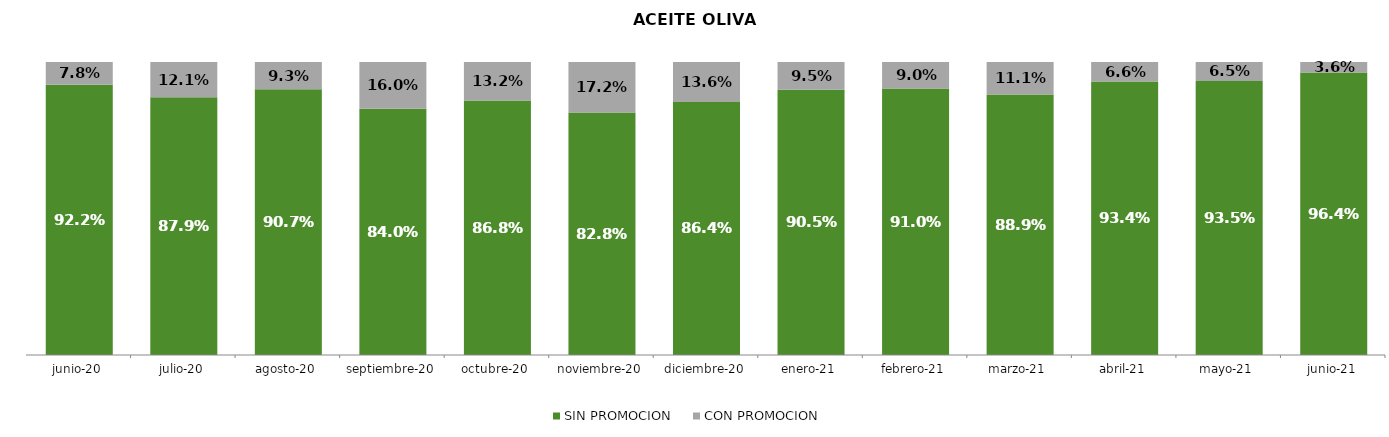
| Category | SIN PROMOCION   | CON PROMOCION   |
|---|---|---|
| 2020-06-01 | 0.922 | 0.078 |
| 2020-07-01 | 0.879 | 0.121 |
| 2020-08-01 | 0.907 | 0.093 |
| 2020-09-01 | 0.84 | 0.16 |
| 2020-10-01 | 0.868 | 0.132 |
| 2020-11-01 | 0.828 | 0.172 |
| 2020-12-01 | 0.864 | 0.136 |
| 2021-01-01 | 0.905 | 0.095 |
| 2021-02-01 | 0.91 | 0.09 |
| 2021-03-01 | 0.889 | 0.111 |
| 2021-04-01 | 0.934 | 0.066 |
| 2021-05-01 | 0.935 | 0.065 |
| 2021-06-01 | 0.964 | 0.036 |